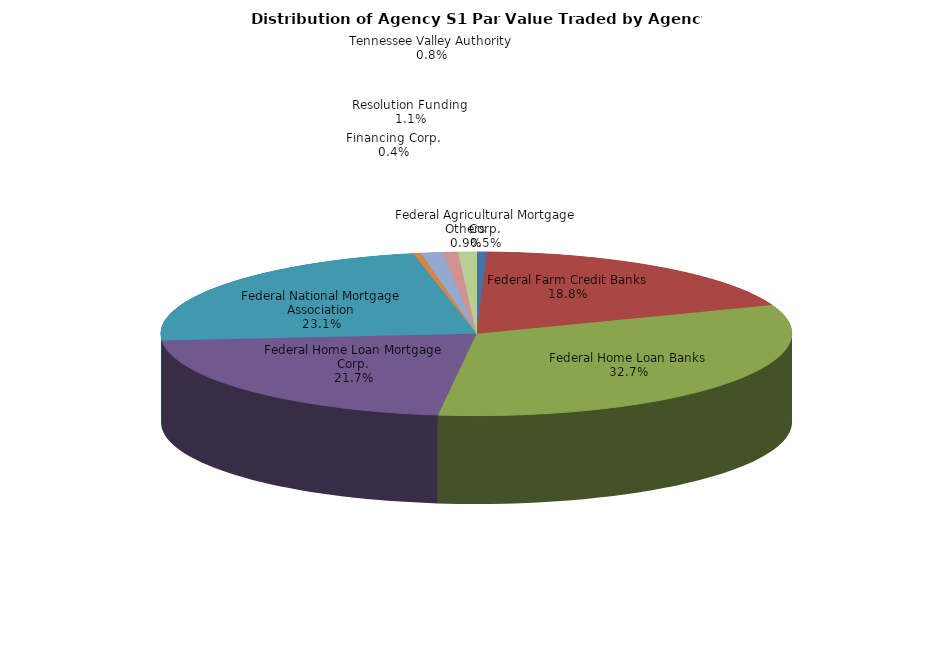
| Category | Series 0 |
|---|---|
| Federal Agricultural Mortgage Corp. | 28451646.825 |
| Federal Farm Credit Banks | 1013367048.413 |
| Federal Home Loan Banks | 1765662810.319 |
| Federal Home Loan Mortgage Corp. | 1175014908.464 |
| Federal National Mortgage Association | 1248441995.343 |
| Financing Corp. | 20756549.603 |
| Resolution Funding | 60118845.238 |
| Tennessee Valley Authority | 41598564.615 |
| Others | 50740370.082 |